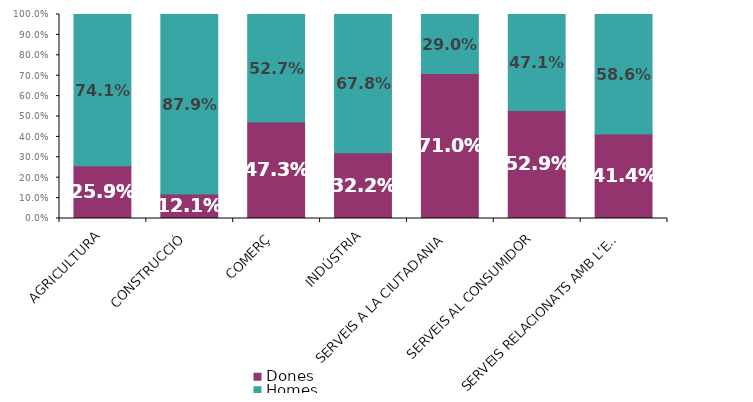
| Category | Dones | Homes |
|---|---|---|
| AGRICULTURA | 0.259 | 0.741 |
| CONSTRUCCIÓ | 0.121 | 0.879 |
| COMERÇ | 0.473 | 0.527 |
| INDÚSTRIA | 0.322 | 0.678 |
| SERVEIS A LA CIUTADANIA | 0.71 | 0.29 |
| SERVEIS AL CONSUMIDOR | 0.529 | 0.471 |
| SERVEIS RELACIONATS AMB L’EMPRESA | 0.414 | 0.586 |